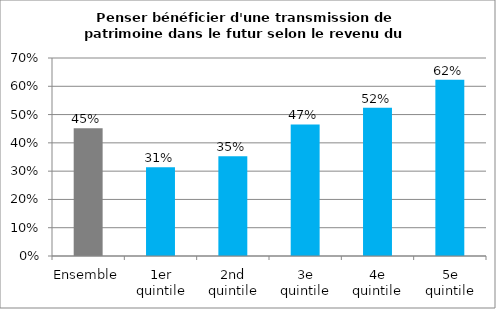
| Category | Penser bénéficier d'une transmission de patrimoine dans le futur selon le revenu du foyer |
|---|---|
| Ensemble | 0.452 |
| 1er quintile | 0.314 |
| 2nd quintile | 0.353 |
| 3e quintile | 0.465 |
| 4e quintile | 0.524 |
| 5e quintile | 0.623 |